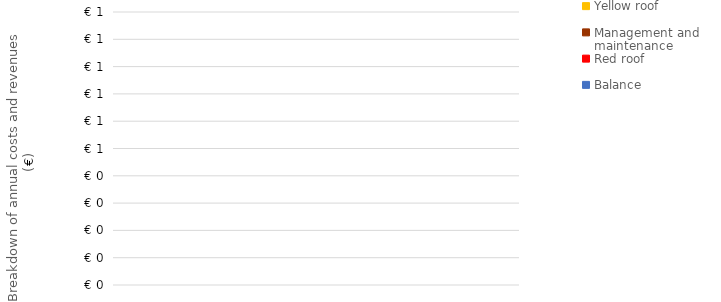
| Category | Yellow roof | Management and maintenance | Red roof | Balance |
|---|---|---|---|---|
| 0 | 0 | 0 | 0 | 0 |